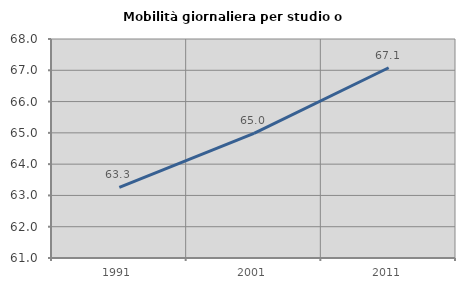
| Category | Mobilità giornaliera per studio o lavoro |
|---|---|
| 1991.0 | 63.26 |
| 2001.0 | 64.984 |
| 2011.0 | 67.081 |